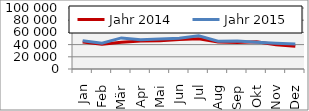
| Category | Jahr 2014 | Jahr 2015 |
|---|---|---|
| Jan | 44405.414 | 46391.265 |
| Feb | 40520.48 | 42351.539 |
| Mär | 43675.813 | 50943.96 |
| Apr | 45977.262 | 47828.543 |
| Mai | 46458.278 | 49356.426 |
| Jun | 48450.076 | 50379.714 |
| Jul | 49643.184 | 54334.214 |
| Aug | 44417.327 | 45388.899 |
| Sep | 43377.016 | 45798.473 |
| Okt | 44671.728 | 44044.699 |
| Nov | 39611.534 | 42127.587 |
| Dez | 37146.773 | 40852.617 |